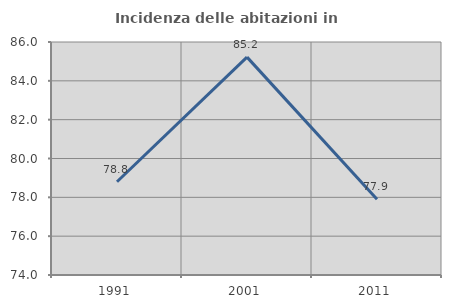
| Category | Incidenza delle abitazioni in proprietà  |
|---|---|
| 1991.0 | 78.801 |
| 2001.0 | 85.221 |
| 2011.0 | 77.902 |